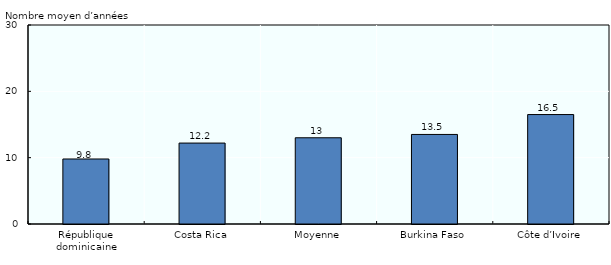
| Category | Années |
|---|---|
| République dominicaine | 9.8 |
| Costa Rica | 12.2 |
| Moyenne | 13 |
| Burkina Faso | 13.5 |
| Côte d’Ivoire | 16.5 |